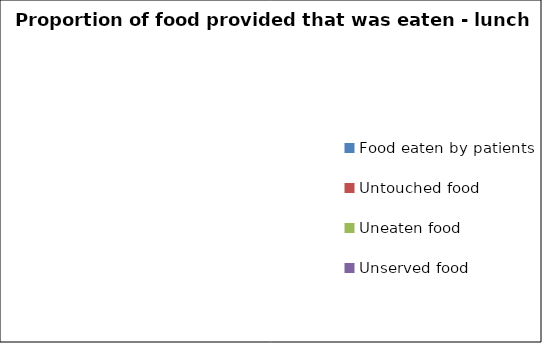
| Category | Proportion of food provided that was eaten - lunch |
|---|---|
| Food eaten by patients | 0 |
| Untouched food | 0 |
| Uneaten food | 0 |
| Unserved food | 0 |